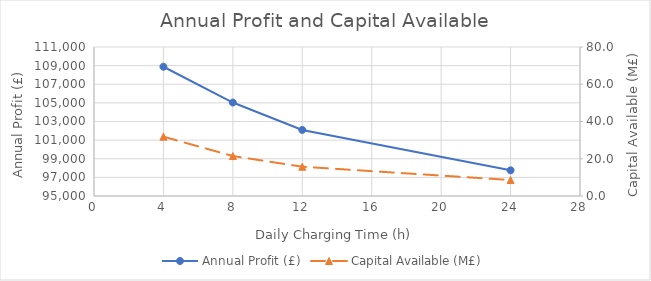
| Category | Annual Profit (£) |
|---|---|
| 4.0 | 108878.759 |
| 8.0 | 105036.421 |
| 12.0 | 102094.891 |
| 24.0 | 97754.329 |